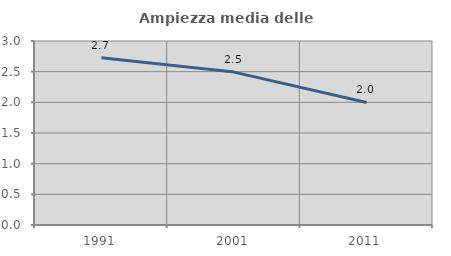
| Category | Ampiezza media delle famiglie |
|---|---|
| 1991.0 | 2.726 |
| 2001.0 | 2.493 |
| 2011.0 | 1.998 |